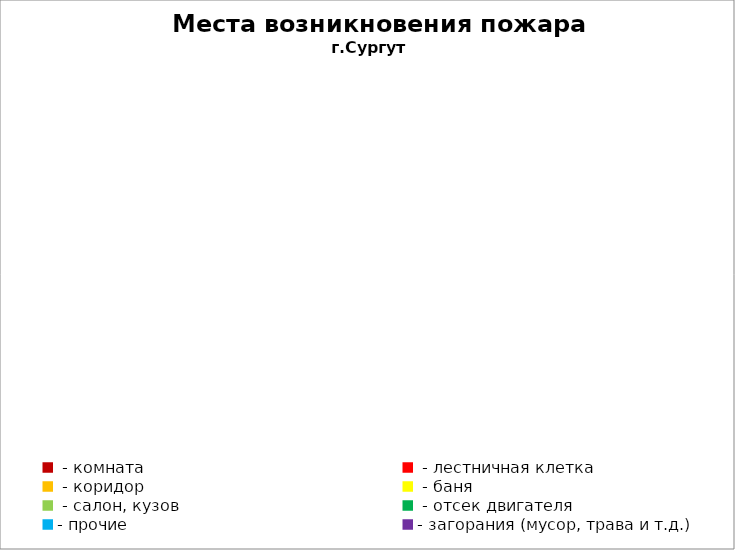
| Category | Места возникновения пожара |
|---|---|
|  - комната | 56 |
|  - лестничная клетка | 27 |
|  - коридор | 10 |
|  - баня | 28 |
|  - салон, кузов | 10 |
|  - отсек двигателя | 35 |
| - прочие | 145 |
| - загорания (мусор, трава и т.д.)  | 171 |